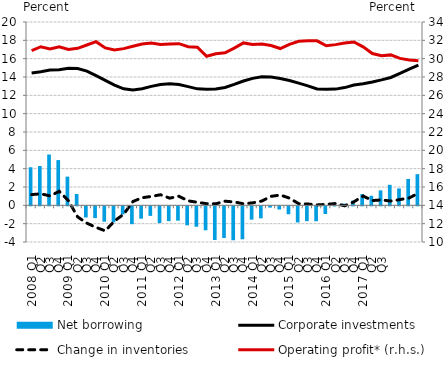
| Category | Net borrowing |
|---|---|
| 2008 Q1 | 4.156 |
| Q2 | 4.29 |
| Q3 | 5.545 |
| Q4 | 4.935 |
| 2009 Q1 | 3.13 |
| Q2 | 1.236 |
| Q3 | -1.214 |
| Q4 | -1.287 |
| 2010 Q1 | -1.668 |
| Q2 | -1.744 |
| Q3 | -0.885 |
| Q4 | -1.945 |
| 2011 Q1 | -1.349 |
| Q2 | -1.042 |
| Q3 | -1.828 |
| Q4 | -1.616 |
| 2012 Q1 | -1.564 |
| Q2 | -2.071 |
| Q3 | -2.225 |
| Q4 | -2.613 |
| 2013 Q1 | -3.675 |
| Q2 | -3.449 |
| Q3 | -3.702 |
| Q4 | -3.595 |
| 2014 Q1 | -1.451 |
| Q2 | -1.309 |
| Q3 | -0.138 |
| Q4 | -0.343 |
| 2015 Q1 | -0.863 |
| Q2 | -1.757 |
| Q3 | -1.615 |
| Q4 | -1.629 |
| 2016 Q1 | -0.834 |
| Q2 | -0.017 |
| Q3 | 0.192 |
| Q4 | 0.513 |
| 2017 Q1 | 1.225 |
| Q2 | 1.041 |
| Q3 | 1.633 |